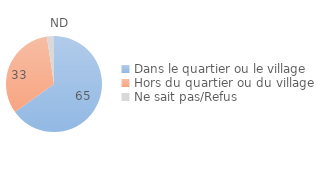
| Category | Series 0 |
|---|---|
| Dans le quartier ou le village | 65.079 |
| Hors du quartier ou du village | 32.535 |
| Ne sait pas/Refus | 2.386 |